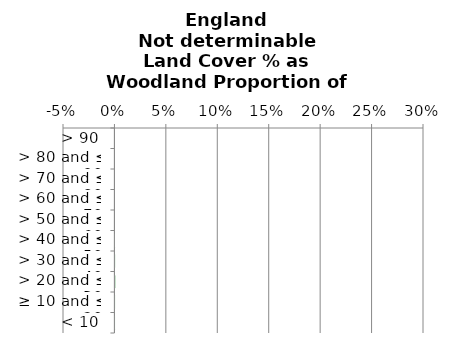
| Category | Not determinable |
|---|---|
|  < 10 | 0 |
|  ≥ 10 and ≤ 20 | 0 |
|  > 20 and ≤ 30 | 0.001 |
|  > 30 and ≤ 40 | 0 |
|  > 40 and ≤ 50 | 0 |
|  > 50 and ≤ 60 | 0 |
|  > 60 and ≤ 70 | 0 |
|  > 70 and ≤ 80 | 0 |
|  > 80 and ≤ 90 | 0 |
|  > 90 | 0 |